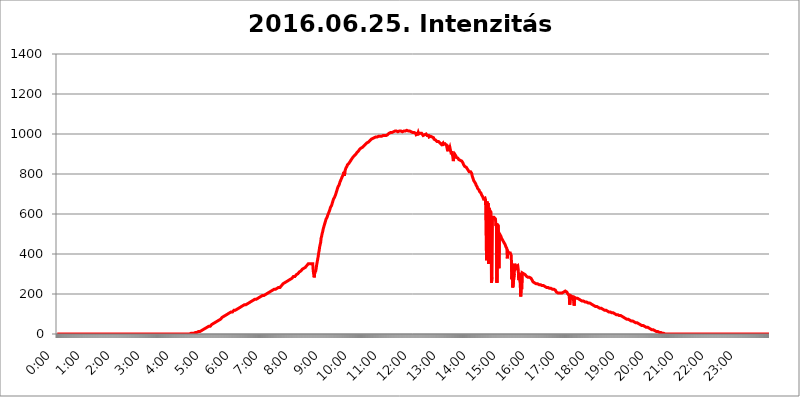
| Category | 2016.06.25. Intenzitás [W/m^2] |
|---|---|
| 0.0 | 0 |
| 0.0006944444444444445 | 0 |
| 0.001388888888888889 | 0 |
| 0.0020833333333333333 | 0 |
| 0.002777777777777778 | 0 |
| 0.003472222222222222 | 0 |
| 0.004166666666666667 | 0 |
| 0.004861111111111111 | 0 |
| 0.005555555555555556 | 0 |
| 0.0062499999999999995 | 0 |
| 0.006944444444444444 | 0 |
| 0.007638888888888889 | 0 |
| 0.008333333333333333 | 0 |
| 0.009027777777777779 | 0 |
| 0.009722222222222222 | 0 |
| 0.010416666666666666 | 0 |
| 0.011111111111111112 | 0 |
| 0.011805555555555555 | 0 |
| 0.012499999999999999 | 0 |
| 0.013194444444444444 | 0 |
| 0.013888888888888888 | 0 |
| 0.014583333333333332 | 0 |
| 0.015277777777777777 | 0 |
| 0.015972222222222224 | 0 |
| 0.016666666666666666 | 0 |
| 0.017361111111111112 | 0 |
| 0.018055555555555557 | 0 |
| 0.01875 | 0 |
| 0.019444444444444445 | 0 |
| 0.02013888888888889 | 0 |
| 0.020833333333333332 | 0 |
| 0.02152777777777778 | 0 |
| 0.022222222222222223 | 0 |
| 0.02291666666666667 | 0 |
| 0.02361111111111111 | 0 |
| 0.024305555555555556 | 0 |
| 0.024999999999999998 | 0 |
| 0.025694444444444447 | 0 |
| 0.02638888888888889 | 0 |
| 0.027083333333333334 | 0 |
| 0.027777777777777776 | 0 |
| 0.02847222222222222 | 0 |
| 0.029166666666666664 | 0 |
| 0.029861111111111113 | 0 |
| 0.030555555555555555 | 0 |
| 0.03125 | 0 |
| 0.03194444444444445 | 0 |
| 0.03263888888888889 | 0 |
| 0.03333333333333333 | 0 |
| 0.034027777777777775 | 0 |
| 0.034722222222222224 | 0 |
| 0.035416666666666666 | 0 |
| 0.036111111111111115 | 0 |
| 0.03680555555555556 | 0 |
| 0.0375 | 0 |
| 0.03819444444444444 | 0 |
| 0.03888888888888889 | 0 |
| 0.03958333333333333 | 0 |
| 0.04027777777777778 | 0 |
| 0.04097222222222222 | 0 |
| 0.041666666666666664 | 0 |
| 0.042361111111111106 | 0 |
| 0.04305555555555556 | 0 |
| 0.043750000000000004 | 0 |
| 0.044444444444444446 | 0 |
| 0.04513888888888889 | 0 |
| 0.04583333333333334 | 0 |
| 0.04652777777777778 | 0 |
| 0.04722222222222222 | 0 |
| 0.04791666666666666 | 0 |
| 0.04861111111111111 | 0 |
| 0.049305555555555554 | 0 |
| 0.049999999999999996 | 0 |
| 0.05069444444444445 | 0 |
| 0.051388888888888894 | 0 |
| 0.052083333333333336 | 0 |
| 0.05277777777777778 | 0 |
| 0.05347222222222222 | 0 |
| 0.05416666666666667 | 0 |
| 0.05486111111111111 | 0 |
| 0.05555555555555555 | 0 |
| 0.05625 | 0 |
| 0.05694444444444444 | 0 |
| 0.057638888888888885 | 0 |
| 0.05833333333333333 | 0 |
| 0.05902777777777778 | 0 |
| 0.059722222222222225 | 0 |
| 0.06041666666666667 | 0 |
| 0.061111111111111116 | 0 |
| 0.06180555555555556 | 0 |
| 0.0625 | 0 |
| 0.06319444444444444 | 0 |
| 0.06388888888888888 | 0 |
| 0.06458333333333334 | 0 |
| 0.06527777777777778 | 0 |
| 0.06597222222222222 | 0 |
| 0.06666666666666667 | 0 |
| 0.06736111111111111 | 0 |
| 0.06805555555555555 | 0 |
| 0.06874999999999999 | 0 |
| 0.06944444444444443 | 0 |
| 0.07013888888888889 | 0 |
| 0.07083333333333333 | 0 |
| 0.07152777777777779 | 0 |
| 0.07222222222222223 | 0 |
| 0.07291666666666667 | 0 |
| 0.07361111111111111 | 0 |
| 0.07430555555555556 | 0 |
| 0.075 | 0 |
| 0.07569444444444444 | 0 |
| 0.0763888888888889 | 0 |
| 0.07708333333333334 | 0 |
| 0.07777777777777778 | 0 |
| 0.07847222222222222 | 0 |
| 0.07916666666666666 | 0 |
| 0.0798611111111111 | 0 |
| 0.08055555555555556 | 0 |
| 0.08125 | 0 |
| 0.08194444444444444 | 0 |
| 0.08263888888888889 | 0 |
| 0.08333333333333333 | 0 |
| 0.08402777777777777 | 0 |
| 0.08472222222222221 | 0 |
| 0.08541666666666665 | 0 |
| 0.08611111111111112 | 0 |
| 0.08680555555555557 | 0 |
| 0.08750000000000001 | 0 |
| 0.08819444444444445 | 0 |
| 0.08888888888888889 | 0 |
| 0.08958333333333333 | 0 |
| 0.09027777777777778 | 0 |
| 0.09097222222222222 | 0 |
| 0.09166666666666667 | 0 |
| 0.09236111111111112 | 0 |
| 0.09305555555555556 | 0 |
| 0.09375 | 0 |
| 0.09444444444444444 | 0 |
| 0.09513888888888888 | 0 |
| 0.09583333333333333 | 0 |
| 0.09652777777777777 | 0 |
| 0.09722222222222222 | 0 |
| 0.09791666666666667 | 0 |
| 0.09861111111111111 | 0 |
| 0.09930555555555555 | 0 |
| 0.09999999999999999 | 0 |
| 0.10069444444444443 | 0 |
| 0.1013888888888889 | 0 |
| 0.10208333333333335 | 0 |
| 0.10277777777777779 | 0 |
| 0.10347222222222223 | 0 |
| 0.10416666666666667 | 0 |
| 0.10486111111111111 | 0 |
| 0.10555555555555556 | 0 |
| 0.10625 | 0 |
| 0.10694444444444444 | 0 |
| 0.1076388888888889 | 0 |
| 0.10833333333333334 | 0 |
| 0.10902777777777778 | 0 |
| 0.10972222222222222 | 0 |
| 0.1111111111111111 | 0 |
| 0.11180555555555556 | 0 |
| 0.11180555555555556 | 0 |
| 0.1125 | 0 |
| 0.11319444444444444 | 0 |
| 0.11388888888888889 | 0 |
| 0.11458333333333333 | 0 |
| 0.11527777777777777 | 0 |
| 0.11597222222222221 | 0 |
| 0.11666666666666665 | 0 |
| 0.1173611111111111 | 0 |
| 0.11805555555555557 | 0 |
| 0.11944444444444445 | 0 |
| 0.12013888888888889 | 0 |
| 0.12083333333333333 | 0 |
| 0.12152777777777778 | 0 |
| 0.12222222222222223 | 0 |
| 0.12291666666666667 | 0 |
| 0.12291666666666667 | 0 |
| 0.12361111111111112 | 0 |
| 0.12430555555555556 | 0 |
| 0.125 | 0 |
| 0.12569444444444444 | 0 |
| 0.12638888888888888 | 0 |
| 0.12708333333333333 | 0 |
| 0.16875 | 0 |
| 0.12847222222222224 | 0 |
| 0.12916666666666668 | 0 |
| 0.12986111111111112 | 0 |
| 0.13055555555555556 | 0 |
| 0.13125 | 0 |
| 0.13194444444444445 | 0 |
| 0.1326388888888889 | 0 |
| 0.13333333333333333 | 0 |
| 0.13402777777777777 | 0 |
| 0.13402777777777777 | 0 |
| 0.13472222222222222 | 0 |
| 0.13541666666666666 | 0 |
| 0.1361111111111111 | 0 |
| 0.13749999999999998 | 0 |
| 0.13819444444444443 | 0 |
| 0.1388888888888889 | 0 |
| 0.13958333333333334 | 0 |
| 0.14027777777777778 | 0 |
| 0.14097222222222222 | 0 |
| 0.14166666666666666 | 0 |
| 0.1423611111111111 | 0 |
| 0.14305555555555557 | 0 |
| 0.14375000000000002 | 0 |
| 0.14444444444444446 | 0 |
| 0.1451388888888889 | 0 |
| 0.1451388888888889 | 0 |
| 0.14652777777777778 | 0 |
| 0.14722222222222223 | 0 |
| 0.14791666666666667 | 0 |
| 0.1486111111111111 | 0 |
| 0.14930555555555555 | 0 |
| 0.15 | 0 |
| 0.15069444444444444 | 0 |
| 0.15138888888888888 | 0 |
| 0.15208333333333332 | 0 |
| 0.15277777777777776 | 0 |
| 0.15347222222222223 | 0 |
| 0.15416666666666667 | 0 |
| 0.15486111111111112 | 0 |
| 0.15555555555555556 | 0 |
| 0.15625 | 0 |
| 0.15694444444444444 | 0 |
| 0.15763888888888888 | 0 |
| 0.15833333333333333 | 0 |
| 0.15902777777777777 | 0 |
| 0.15972222222222224 | 0 |
| 0.16041666666666668 | 0 |
| 0.16111111111111112 | 0 |
| 0.16180555555555556 | 0 |
| 0.1625 | 0 |
| 0.16319444444444445 | 0 |
| 0.1638888888888889 | 0 |
| 0.16458333333333333 | 0 |
| 0.16527777777777777 | 0 |
| 0.16597222222222222 | 0 |
| 0.16666666666666666 | 0 |
| 0.1673611111111111 | 0 |
| 0.16805555555555554 | 0 |
| 0.16874999999999998 | 0 |
| 0.16944444444444443 | 0 |
| 0.17013888888888887 | 0 |
| 0.1708333333333333 | 0 |
| 0.17152777777777775 | 0 |
| 0.17222222222222225 | 0 |
| 0.1729166666666667 | 0 |
| 0.17361111111111113 | 0 |
| 0.17430555555555557 | 0 |
| 0.17500000000000002 | 0 |
| 0.17569444444444446 | 0 |
| 0.1763888888888889 | 0 |
| 0.17708333333333334 | 0 |
| 0.17777777777777778 | 0 |
| 0.17847222222222223 | 0 |
| 0.17916666666666667 | 0 |
| 0.1798611111111111 | 0 |
| 0.18055555555555555 | 0 |
| 0.18125 | 0 |
| 0.18194444444444444 | 0 |
| 0.1826388888888889 | 0 |
| 0.18333333333333335 | 0 |
| 0.1840277777777778 | 0 |
| 0.18472222222222223 | 0 |
| 0.18541666666666667 | 0 |
| 0.18611111111111112 | 3.525 |
| 0.18680555555555556 | 0 |
| 0.1875 | 3.525 |
| 0.18819444444444444 | 3.525 |
| 0.18888888888888888 | 3.525 |
| 0.18958333333333333 | 3.525 |
| 0.19027777777777777 | 3.525 |
| 0.1909722222222222 | 3.525 |
| 0.19166666666666665 | 3.525 |
| 0.19236111111111112 | 3.525 |
| 0.19305555555555554 | 3.525 |
| 0.19375 | 7.887 |
| 0.19444444444444445 | 7.887 |
| 0.1951388888888889 | 7.887 |
| 0.19583333333333333 | 7.887 |
| 0.19652777777777777 | 7.887 |
| 0.19722222222222222 | 12.257 |
| 0.19791666666666666 | 12.257 |
| 0.1986111111111111 | 12.257 |
| 0.19930555555555554 | 12.257 |
| 0.19999999999999998 | 12.257 |
| 0.20069444444444443 | 16.636 |
| 0.20138888888888887 | 16.636 |
| 0.2020833333333333 | 16.636 |
| 0.2027777777777778 | 21.024 |
| 0.2034722222222222 | 21.024 |
| 0.2041666666666667 | 21.024 |
| 0.20486111111111113 | 21.024 |
| 0.20555555555555557 | 21.024 |
| 0.20625000000000002 | 25.419 |
| 0.20694444444444446 | 25.419 |
| 0.2076388888888889 | 25.419 |
| 0.20833333333333334 | 29.823 |
| 0.20902777777777778 | 29.823 |
| 0.20972222222222223 | 29.823 |
| 0.21041666666666667 | 34.234 |
| 0.2111111111111111 | 34.234 |
| 0.21180555555555555 | 34.234 |
| 0.2125 | 38.653 |
| 0.21319444444444444 | 38.653 |
| 0.2138888888888889 | 38.653 |
| 0.21458333333333335 | 38.653 |
| 0.2152777777777778 | 43.079 |
| 0.21597222222222223 | 43.079 |
| 0.21666666666666667 | 47.511 |
| 0.21736111111111112 | 47.511 |
| 0.21805555555555556 | 47.511 |
| 0.21875 | 51.951 |
| 0.21944444444444444 | 51.951 |
| 0.22013888888888888 | 51.951 |
| 0.22083333333333333 | 56.398 |
| 0.22152777777777777 | 56.398 |
| 0.2222222222222222 | 60.85 |
| 0.22291666666666665 | 60.85 |
| 0.2236111111111111 | 60.85 |
| 0.22430555555555556 | 65.31 |
| 0.225 | 65.31 |
| 0.22569444444444445 | 69.775 |
| 0.2263888888888889 | 69.775 |
| 0.22708333333333333 | 69.775 |
| 0.22777777777777777 | 74.246 |
| 0.22847222222222222 | 74.246 |
| 0.22916666666666666 | 74.246 |
| 0.2298611111111111 | 78.722 |
| 0.23055555555555554 | 78.722 |
| 0.23124999999999998 | 83.205 |
| 0.23194444444444443 | 83.205 |
| 0.23263888888888887 | 83.205 |
| 0.2333333333333333 | 87.692 |
| 0.2340277777777778 | 87.692 |
| 0.2347222222222222 | 87.692 |
| 0.2354166666666667 | 92.184 |
| 0.23611111111111113 | 92.184 |
| 0.23680555555555557 | 92.184 |
| 0.23750000000000002 | 96.682 |
| 0.23819444444444446 | 96.682 |
| 0.2388888888888889 | 101.184 |
| 0.23958333333333334 | 101.184 |
| 0.24027777777777778 | 101.184 |
| 0.24097222222222223 | 101.184 |
| 0.24166666666666667 | 105.69 |
| 0.2423611111111111 | 105.69 |
| 0.24305555555555555 | 105.69 |
| 0.24375 | 110.201 |
| 0.24444444444444446 | 110.201 |
| 0.24513888888888888 | 110.201 |
| 0.24583333333333335 | 110.201 |
| 0.2465277777777778 | 114.716 |
| 0.24722222222222223 | 114.716 |
| 0.24791666666666667 | 119.235 |
| 0.24861111111111112 | 119.235 |
| 0.24930555555555556 | 119.235 |
| 0.25 | 119.235 |
| 0.25069444444444444 | 123.758 |
| 0.2513888888888889 | 123.758 |
| 0.2520833333333333 | 123.758 |
| 0.25277777777777777 | 128.284 |
| 0.2534722222222222 | 128.284 |
| 0.25416666666666665 | 128.284 |
| 0.2548611111111111 | 128.284 |
| 0.2555555555555556 | 132.814 |
| 0.25625000000000003 | 132.814 |
| 0.2569444444444445 | 132.814 |
| 0.2576388888888889 | 137.347 |
| 0.25833333333333336 | 137.347 |
| 0.2590277777777778 | 137.347 |
| 0.25972222222222224 | 137.347 |
| 0.2604166666666667 | 141.884 |
| 0.2611111111111111 | 141.884 |
| 0.26180555555555557 | 141.884 |
| 0.2625 | 146.423 |
| 0.26319444444444445 | 146.423 |
| 0.2638888888888889 | 146.423 |
| 0.26458333333333334 | 146.423 |
| 0.2652777777777778 | 150.964 |
| 0.2659722222222222 | 150.964 |
| 0.26666666666666666 | 150.964 |
| 0.2673611111111111 | 155.509 |
| 0.26805555555555555 | 155.509 |
| 0.26875 | 155.509 |
| 0.26944444444444443 | 155.509 |
| 0.2701388888888889 | 160.056 |
| 0.2708333333333333 | 160.056 |
| 0.27152777777777776 | 160.056 |
| 0.2722222222222222 | 164.605 |
| 0.27291666666666664 | 164.605 |
| 0.2736111111111111 | 164.605 |
| 0.2743055555555555 | 164.605 |
| 0.27499999999999997 | 169.156 |
| 0.27569444444444446 | 169.156 |
| 0.27638888888888885 | 169.156 |
| 0.27708333333333335 | 173.709 |
| 0.2777777777777778 | 173.709 |
| 0.27847222222222223 | 173.709 |
| 0.2791666666666667 | 173.709 |
| 0.2798611111111111 | 178.264 |
| 0.28055555555555556 | 178.264 |
| 0.28125 | 178.264 |
| 0.28194444444444444 | 182.82 |
| 0.2826388888888889 | 182.82 |
| 0.2833333333333333 | 182.82 |
| 0.28402777777777777 | 182.82 |
| 0.2847222222222222 | 187.378 |
| 0.28541666666666665 | 187.378 |
| 0.28611111111111115 | 187.378 |
| 0.28680555555555554 | 191.937 |
| 0.28750000000000003 | 191.937 |
| 0.2881944444444445 | 191.937 |
| 0.2888888888888889 | 191.937 |
| 0.28958333333333336 | 191.937 |
| 0.2902777777777778 | 191.937 |
| 0.29097222222222224 | 196.497 |
| 0.2916666666666667 | 196.497 |
| 0.2923611111111111 | 196.497 |
| 0.29305555555555557 | 201.058 |
| 0.29375 | 201.058 |
| 0.29444444444444445 | 201.058 |
| 0.2951388888888889 | 205.62 |
| 0.29583333333333334 | 205.62 |
| 0.2965277777777778 | 205.62 |
| 0.2972222222222222 | 210.182 |
| 0.29791666666666666 | 210.182 |
| 0.2986111111111111 | 210.182 |
| 0.29930555555555555 | 210.182 |
| 0.3 | 214.746 |
| 0.30069444444444443 | 214.746 |
| 0.3013888888888889 | 214.746 |
| 0.3020833333333333 | 219.309 |
| 0.30277777777777776 | 219.309 |
| 0.3034722222222222 | 219.309 |
| 0.30416666666666664 | 223.873 |
| 0.3048611111111111 | 223.873 |
| 0.3055555555555555 | 223.873 |
| 0.30624999999999997 | 223.873 |
| 0.3069444444444444 | 228.436 |
| 0.3076388888888889 | 228.436 |
| 0.30833333333333335 | 228.436 |
| 0.3090277777777778 | 228.436 |
| 0.30972222222222223 | 228.436 |
| 0.3104166666666667 | 233 |
| 0.3111111111111111 | 233 |
| 0.31180555555555556 | 233 |
| 0.3125 | 233 |
| 0.31319444444444444 | 237.564 |
| 0.3138888888888889 | 237.564 |
| 0.3145833333333333 | 242.127 |
| 0.31527777777777777 | 242.127 |
| 0.3159722222222222 | 246.689 |
| 0.31666666666666665 | 251.251 |
| 0.31736111111111115 | 251.251 |
| 0.31805555555555554 | 251.251 |
| 0.31875000000000003 | 255.813 |
| 0.3194444444444445 | 255.813 |
| 0.3201388888888889 | 260.373 |
| 0.32083333333333336 | 260.373 |
| 0.3215277777777778 | 260.373 |
| 0.32222222222222224 | 260.373 |
| 0.3229166666666667 | 264.932 |
| 0.3236111111111111 | 264.932 |
| 0.32430555555555557 | 269.49 |
| 0.325 | 269.49 |
| 0.32569444444444445 | 269.49 |
| 0.3263888888888889 | 274.047 |
| 0.32708333333333334 | 274.047 |
| 0.3277777777777778 | 278.603 |
| 0.3284722222222222 | 278.603 |
| 0.32916666666666666 | 278.603 |
| 0.3298611111111111 | 283.156 |
| 0.33055555555555555 | 283.156 |
| 0.33125 | 287.709 |
| 0.33194444444444443 | 287.709 |
| 0.3326388888888889 | 287.709 |
| 0.3333333333333333 | 287.709 |
| 0.3340277777777778 | 292.259 |
| 0.3347222222222222 | 292.259 |
| 0.3354166666666667 | 296.808 |
| 0.3361111111111111 | 296.808 |
| 0.3368055555555556 | 296.808 |
| 0.33749999999999997 | 301.354 |
| 0.33819444444444446 | 305.898 |
| 0.33888888888888885 | 305.898 |
| 0.33958333333333335 | 310.44 |
| 0.34027777777777773 | 310.44 |
| 0.34097222222222223 | 314.98 |
| 0.3416666666666666 | 314.98 |
| 0.3423611111111111 | 314.98 |
| 0.3430555555555555 | 319.517 |
| 0.34375 | 324.052 |
| 0.3444444444444445 | 324.052 |
| 0.3451388888888889 | 324.052 |
| 0.3458333333333334 | 328.584 |
| 0.34652777777777777 | 328.584 |
| 0.34722222222222227 | 333.113 |
| 0.34791666666666665 | 333.113 |
| 0.34861111111111115 | 337.639 |
| 0.34930555555555554 | 337.639 |
| 0.35000000000000003 | 342.162 |
| 0.3506944444444444 | 342.162 |
| 0.3513888888888889 | 346.682 |
| 0.3520833333333333 | 351.198 |
| 0.3527777777777778 | 351.198 |
| 0.3534722222222222 | 351.198 |
| 0.3541666666666667 | 351.198 |
| 0.3548611111111111 | 355.712 |
| 0.35555555555555557 | 351.198 |
| 0.35625 | 351.198 |
| 0.35694444444444445 | 351.198 |
| 0.3576388888888889 | 351.198 |
| 0.35833333333333334 | 351.198 |
| 0.3590277777777778 | 314.98 |
| 0.3597222222222222 | 319.517 |
| 0.36041666666666666 | 283.156 |
| 0.3611111111111111 | 305.898 |
| 0.36180555555555555 | 301.354 |
| 0.3625 | 314.98 |
| 0.36319444444444443 | 328.584 |
| 0.3638888888888889 | 346.682 |
| 0.3645833333333333 | 360.221 |
| 0.3652777777777778 | 364.728 |
| 0.3659722222222222 | 387.202 |
| 0.3666666666666667 | 405.108 |
| 0.3673611111111111 | 418.492 |
| 0.3680555555555556 | 436.27 |
| 0.36874999999999997 | 440.702 |
| 0.36944444444444446 | 458.38 |
| 0.37013888888888885 | 480.356 |
| 0.37083333333333335 | 489.108 |
| 0.37152777777777773 | 502.192 |
| 0.37222222222222223 | 510.885 |
| 0.3729166666666666 | 523.88 |
| 0.3736111111111111 | 532.513 |
| 0.3743055555555555 | 541.121 |
| 0.375 | 549.704 |
| 0.3756944444444445 | 558.261 |
| 0.3763888888888889 | 566.793 |
| 0.3770833333333334 | 575.299 |
| 0.37777777777777777 | 579.542 |
| 0.37847222222222227 | 583.779 |
| 0.37916666666666665 | 592.233 |
| 0.37986111111111115 | 596.45 |
| 0.38055555555555554 | 604.864 |
| 0.38125000000000003 | 609.062 |
| 0.3819444444444444 | 617.436 |
| 0.3826388888888889 | 625.784 |
| 0.3833333333333333 | 634.105 |
| 0.3840277777777778 | 638.256 |
| 0.3847222222222222 | 642.4 |
| 0.3854166666666667 | 650.667 |
| 0.3861111111111111 | 658.909 |
| 0.38680555555555557 | 667.123 |
| 0.3875 | 675.311 |
| 0.38819444444444445 | 679.395 |
| 0.3888888888888889 | 683.473 |
| 0.38958333333333334 | 687.544 |
| 0.3902777777777778 | 695.666 |
| 0.3909722222222222 | 703.762 |
| 0.39166666666666666 | 711.832 |
| 0.3923611111111111 | 719.877 |
| 0.39305555555555555 | 727.896 |
| 0.39375 | 735.89 |
| 0.39444444444444443 | 739.877 |
| 0.3951388888888889 | 743.859 |
| 0.3958333333333333 | 751.803 |
| 0.3965277777777778 | 759.723 |
| 0.3972222222222222 | 763.674 |
| 0.3979166666666667 | 771.559 |
| 0.3986111111111111 | 767.62 |
| 0.3993055555555556 | 783.342 |
| 0.39999999999999997 | 787.258 |
| 0.40069444444444446 | 787.258 |
| 0.40138888888888885 | 798.974 |
| 0.40208333333333335 | 810.641 |
| 0.40277777777777773 | 791.169 |
| 0.40347222222222223 | 814.519 |
| 0.4041666666666666 | 822.26 |
| 0.4048611111111111 | 829.981 |
| 0.4055555555555555 | 833.834 |
| 0.40625 | 837.682 |
| 0.4069444444444445 | 845.365 |
| 0.4076388888888889 | 845.365 |
| 0.4083333333333334 | 849.199 |
| 0.40902777777777777 | 853.029 |
| 0.40972222222222227 | 856.855 |
| 0.41041666666666665 | 860.676 |
| 0.41111111111111115 | 864.493 |
| 0.41180555555555554 | 868.305 |
| 0.41250000000000003 | 872.114 |
| 0.4131944444444444 | 875.918 |
| 0.4138888888888889 | 879.719 |
| 0.4145833333333333 | 883.516 |
| 0.4152777777777778 | 883.516 |
| 0.4159722222222222 | 887.309 |
| 0.4166666666666667 | 891.099 |
| 0.4173611111111111 | 891.099 |
| 0.41805555555555557 | 894.885 |
| 0.41875 | 898.668 |
| 0.41944444444444445 | 902.447 |
| 0.4201388888888889 | 906.223 |
| 0.42083333333333334 | 909.996 |
| 0.4215277777777778 | 909.996 |
| 0.4222222222222222 | 913.766 |
| 0.42291666666666666 | 917.534 |
| 0.4236111111111111 | 921.298 |
| 0.42430555555555555 | 921.298 |
| 0.425 | 925.06 |
| 0.42569444444444443 | 928.819 |
| 0.4263888888888889 | 928.819 |
| 0.4270833333333333 | 928.819 |
| 0.4277777777777778 | 932.576 |
| 0.4284722222222222 | 932.576 |
| 0.4291666666666667 | 936.33 |
| 0.4298611111111111 | 940.082 |
| 0.4305555555555556 | 940.082 |
| 0.43124999999999997 | 943.832 |
| 0.43194444444444446 | 947.58 |
| 0.43263888888888885 | 947.58 |
| 0.43333333333333335 | 951.327 |
| 0.43402777777777773 | 955.071 |
| 0.43472222222222223 | 955.071 |
| 0.4354166666666666 | 958.814 |
| 0.4361111111111111 | 958.814 |
| 0.4368055555555555 | 962.555 |
| 0.4375 | 962.555 |
| 0.4381944444444445 | 966.295 |
| 0.4388888888888889 | 966.295 |
| 0.4395833333333334 | 970.034 |
| 0.44027777777777777 | 973.772 |
| 0.44097222222222227 | 973.772 |
| 0.44166666666666665 | 973.772 |
| 0.44236111111111115 | 977.508 |
| 0.44305555555555554 | 977.508 |
| 0.44375000000000003 | 981.244 |
| 0.4444444444444444 | 981.244 |
| 0.4451388888888889 | 981.244 |
| 0.4458333333333333 | 984.98 |
| 0.4465277777777778 | 984.98 |
| 0.4472222222222222 | 988.714 |
| 0.4479166666666667 | 984.98 |
| 0.4486111111111111 | 984.98 |
| 0.44930555555555557 | 988.714 |
| 0.45 | 988.714 |
| 0.45069444444444445 | 988.714 |
| 0.4513888888888889 | 988.714 |
| 0.45208333333333334 | 984.98 |
| 0.4527777777777778 | 988.714 |
| 0.4534722222222222 | 984.98 |
| 0.45416666666666666 | 984.98 |
| 0.4548611111111111 | 988.714 |
| 0.45555555555555555 | 988.714 |
| 0.45625 | 992.448 |
| 0.45694444444444443 | 992.448 |
| 0.4576388888888889 | 992.448 |
| 0.4583333333333333 | 992.448 |
| 0.4590277777777778 | 992.448 |
| 0.4597222222222222 | 996.182 |
| 0.4604166666666667 | 996.182 |
| 0.4611111111111111 | 992.448 |
| 0.4618055555555556 | 992.448 |
| 0.46249999999999997 | 996.182 |
| 0.46319444444444446 | 996.182 |
| 0.46388888888888885 | 999.916 |
| 0.46458333333333335 | 999.916 |
| 0.46527777777777773 | 1003.65 |
| 0.46597222222222223 | 1003.65 |
| 0.4666666666666666 | 1003.65 |
| 0.4673611111111111 | 1007.383 |
| 0.4680555555555555 | 1007.383 |
| 0.46875 | 1007.383 |
| 0.4694444444444445 | 1007.383 |
| 0.4701388888888889 | 1007.383 |
| 0.4708333333333334 | 1007.383 |
| 0.47152777777777777 | 1011.118 |
| 0.47222222222222227 | 1011.118 |
| 0.47291666666666665 | 1014.852 |
| 0.47361111111111115 | 1014.852 |
| 0.47430555555555554 | 1014.852 |
| 0.47500000000000003 | 1014.852 |
| 0.4756944444444444 | 1014.852 |
| 0.4763888888888889 | 1014.852 |
| 0.4770833333333333 | 1011.118 |
| 0.4777777777777778 | 1011.118 |
| 0.4784722222222222 | 1011.118 |
| 0.4791666666666667 | 1011.118 |
| 0.4798611111111111 | 1014.852 |
| 0.48055555555555557 | 1011.118 |
| 0.48125 | 1014.852 |
| 0.48194444444444445 | 1014.852 |
| 0.4826388888888889 | 1014.852 |
| 0.48333333333333334 | 1014.852 |
| 0.4840277777777778 | 1011.118 |
| 0.4847222222222222 | 1011.118 |
| 0.48541666666666666 | 1011.118 |
| 0.4861111111111111 | 1014.852 |
| 0.48680555555555555 | 1011.118 |
| 0.4875 | 1011.118 |
| 0.48819444444444443 | 1014.852 |
| 0.4888888888888889 | 1014.852 |
| 0.4895833333333333 | 1014.852 |
| 0.4902777777777778 | 1018.587 |
| 0.4909722222222222 | 1014.852 |
| 0.4916666666666667 | 1014.852 |
| 0.4923611111111111 | 1014.852 |
| 0.4930555555555556 | 1014.852 |
| 0.49374999999999997 | 1014.852 |
| 0.49444444444444446 | 1014.852 |
| 0.49513888888888885 | 1011.118 |
| 0.49583333333333335 | 1014.852 |
| 0.49652777777777773 | 1011.118 |
| 0.49722222222222223 | 1011.118 |
| 0.4979166666666666 | 1011.118 |
| 0.4986111111111111 | 1007.383 |
| 0.4993055555555555 | 1007.383 |
| 0.5 | 1007.383 |
| 0.5006944444444444 | 1007.383 |
| 0.5013888888888889 | 1007.383 |
| 0.5020833333333333 | 1007.383 |
| 0.5027777777777778 | 1003.65 |
| 0.5034722222222222 | 996.182 |
| 0.5041666666666667 | 992.448 |
| 0.5048611111111111 | 996.182 |
| 0.5055555555555555 | 999.916 |
| 0.50625 | 1007.383 |
| 0.5069444444444444 | 999.916 |
| 0.5076388888888889 | 996.182 |
| 0.5083333333333333 | 999.916 |
| 0.5090277777777777 | 1003.65 |
| 0.5097222222222222 | 999.916 |
| 0.5104166666666666 | 999.916 |
| 0.5111111111111112 | 1003.65 |
| 0.5118055555555555 | 1003.65 |
| 0.5125000000000001 | 999.916 |
| 0.5131944444444444 | 992.448 |
| 0.513888888888889 | 992.448 |
| 0.5145833333333333 | 992.448 |
| 0.5152777777777778 | 996.182 |
| 0.5159722222222222 | 999.916 |
| 0.5166666666666667 | 999.916 |
| 0.517361111111111 | 999.916 |
| 0.5180555555555556 | 996.182 |
| 0.5187499999999999 | 992.448 |
| 0.5194444444444445 | 992.448 |
| 0.5201388888888888 | 992.448 |
| 0.5208333333333334 | 992.448 |
| 0.5215277777777778 | 984.98 |
| 0.5222222222222223 | 984.98 |
| 0.5229166666666667 | 984.98 |
| 0.5236111111111111 | 988.714 |
| 0.5243055555555556 | 988.714 |
| 0.525 | 984.98 |
| 0.5256944444444445 | 984.98 |
| 0.5263888888888889 | 981.244 |
| 0.5270833333333333 | 981.244 |
| 0.5277777777777778 | 981.244 |
| 0.5284722222222222 | 973.772 |
| 0.5291666666666667 | 970.034 |
| 0.5298611111111111 | 973.772 |
| 0.5305555555555556 | 970.034 |
| 0.53125 | 970.034 |
| 0.5319444444444444 | 966.295 |
| 0.5326388888888889 | 962.555 |
| 0.5333333333333333 | 966.295 |
| 0.5340277777777778 | 962.555 |
| 0.5347222222222222 | 962.555 |
| 0.5354166666666667 | 962.555 |
| 0.5361111111111111 | 958.814 |
| 0.5368055555555555 | 955.071 |
| 0.5375 | 955.071 |
| 0.5381944444444444 | 955.071 |
| 0.5388888888888889 | 947.58 |
| 0.5395833333333333 | 951.327 |
| 0.5402777777777777 | 951.327 |
| 0.5409722222222222 | 955.071 |
| 0.5416666666666666 | 947.58 |
| 0.5423611111111112 | 951.327 |
| 0.5430555555555555 | 947.58 |
| 0.5437500000000001 | 951.327 |
| 0.5444444444444444 | 947.58 |
| 0.545138888888889 | 947.58 |
| 0.5458333333333333 | 943.832 |
| 0.5465277777777778 | 943.832 |
| 0.5472222222222222 | 921.298 |
| 0.5479166666666667 | 913.766 |
| 0.548611111111111 | 932.576 |
| 0.5493055555555556 | 936.33 |
| 0.5499999999999999 | 925.06 |
| 0.5506944444444445 | 932.576 |
| 0.5513888888888888 | 928.819 |
| 0.5520833333333334 | 928.819 |
| 0.5527777777777778 | 898.668 |
| 0.5534722222222223 | 913.766 |
| 0.5541666666666667 | 898.668 |
| 0.5548611111111111 | 883.516 |
| 0.5555555555555556 | 864.493 |
| 0.55625 | 883.516 |
| 0.5569444444444445 | 887.309 |
| 0.5576388888888889 | 898.668 |
| 0.5583333333333333 | 894.885 |
| 0.5590277777777778 | 891.099 |
| 0.5597222222222222 | 883.516 |
| 0.5604166666666667 | 887.309 |
| 0.5611111111111111 | 883.516 |
| 0.5618055555555556 | 879.719 |
| 0.5625 | 875.918 |
| 0.5631944444444444 | 872.114 |
| 0.5638888888888889 | 875.918 |
| 0.5645833333333333 | 868.305 |
| 0.5652777777777778 | 868.305 |
| 0.5659722222222222 | 868.305 |
| 0.5666666666666667 | 868.305 |
| 0.5673611111111111 | 864.493 |
| 0.5680555555555555 | 864.493 |
| 0.56875 | 856.855 |
| 0.5694444444444444 | 853.029 |
| 0.5701388888888889 | 845.365 |
| 0.5708333333333333 | 841.526 |
| 0.5715277777777777 | 837.682 |
| 0.5722222222222222 | 837.682 |
| 0.5729166666666666 | 833.834 |
| 0.5736111111111112 | 833.834 |
| 0.5743055555555555 | 833.834 |
| 0.5750000000000001 | 826.123 |
| 0.5756944444444444 | 822.26 |
| 0.576388888888889 | 818.392 |
| 0.5770833333333333 | 814.519 |
| 0.5777777777777778 | 810.641 |
| 0.5784722222222222 | 810.641 |
| 0.5791666666666667 | 810.641 |
| 0.579861111111111 | 810.641 |
| 0.5805555555555556 | 810.641 |
| 0.5812499999999999 | 802.868 |
| 0.5819444444444445 | 791.169 |
| 0.5826388888888888 | 787.258 |
| 0.5833333333333334 | 775.492 |
| 0.5840277777777778 | 767.62 |
| 0.5847222222222223 | 767.62 |
| 0.5854166666666667 | 759.723 |
| 0.5861111111111111 | 755.766 |
| 0.5868055555555556 | 751.803 |
| 0.5875 | 743.859 |
| 0.5881944444444445 | 743.859 |
| 0.5888888888888889 | 735.89 |
| 0.5895833333333333 | 727.896 |
| 0.5902777777777778 | 727.896 |
| 0.5909722222222222 | 723.889 |
| 0.5916666666666667 | 719.877 |
| 0.5923611111111111 | 711.832 |
| 0.5930555555555556 | 711.832 |
| 0.59375 | 707.8 |
| 0.5944444444444444 | 703.762 |
| 0.5951388888888889 | 695.666 |
| 0.5958333333333333 | 691.608 |
| 0.5965277777777778 | 687.544 |
| 0.5972222222222222 | 683.473 |
| 0.5979166666666667 | 675.311 |
| 0.5986111111111111 | 675.311 |
| 0.5993055555555555 | 679.395 |
| 0.6 | 679.395 |
| 0.6006944444444444 | 671.22 |
| 0.6013888888888889 | 675.311 |
| 0.6020833333333333 | 369.23 |
| 0.6027777777777777 | 663.019 |
| 0.6034722222222222 | 440.702 |
| 0.6041666666666666 | 654.791 |
| 0.6048611111111112 | 351.198 |
| 0.6055555555555555 | 629.948 |
| 0.6062500000000001 | 621.613 |
| 0.6069444444444444 | 617.436 |
| 0.607638888888889 | 617.436 |
| 0.6083333333333333 | 609.062 |
| 0.6090277777777778 | 255.813 |
| 0.6097222222222222 | 283.156 |
| 0.6104166666666667 | 583.779 |
| 0.611111111111111 | 579.542 |
| 0.6118055555555556 | 579.542 |
| 0.6124999999999999 | 583.779 |
| 0.6131944444444445 | 579.542 |
| 0.6138888888888888 | 579.542 |
| 0.6145833333333334 | 575.299 |
| 0.6152777777777778 | 541.121 |
| 0.6159722222222223 | 553.986 |
| 0.6166666666666667 | 255.813 |
| 0.6173611111111111 | 549.704 |
| 0.6180555555555556 | 545.416 |
| 0.61875 | 536.82 |
| 0.6194444444444445 | 328.584 |
| 0.6201388888888889 | 489.108 |
| 0.6208333333333333 | 497.836 |
| 0.6215277777777778 | 493.475 |
| 0.6222222222222222 | 489.108 |
| 0.6229166666666667 | 480.356 |
| 0.6236111111111111 | 475.972 |
| 0.6243055555555556 | 471.582 |
| 0.625 | 471.582 |
| 0.6256944444444444 | 462.786 |
| 0.6263888888888889 | 462.786 |
| 0.6270833333333333 | 453.968 |
| 0.6277777777777778 | 449.551 |
| 0.6284722222222222 | 445.129 |
| 0.6291666666666667 | 436.27 |
| 0.6298611111111111 | 431.833 |
| 0.6305555555555555 | 427.39 |
| 0.63125 | 378.224 |
| 0.6319444444444444 | 414.035 |
| 0.6326388888888889 | 409.574 |
| 0.6333333333333333 | 405.108 |
| 0.6340277777777777 | 409.574 |
| 0.6347222222222222 | 405.108 |
| 0.6354166666666666 | 405.108 |
| 0.6361111111111112 | 405.108 |
| 0.6368055555555555 | 391.685 |
| 0.6375000000000001 | 274.047 |
| 0.6381944444444444 | 351.198 |
| 0.638888888888889 | 233 |
| 0.6395833333333333 | 228.436 |
| 0.6402777777777778 | 233 |
| 0.6409722222222222 | 301.354 |
| 0.6416666666666667 | 351.198 |
| 0.642361111111111 | 337.639 |
| 0.6430555555555556 | 319.517 |
| 0.6437499999999999 | 337.639 |
| 0.6444444444444445 | 337.639 |
| 0.6451388888888888 | 342.162 |
| 0.6458333333333334 | 342.162 |
| 0.6465277777777778 | 324.052 |
| 0.6472222222222223 | 269.49 |
| 0.6479166666666667 | 278.603 |
| 0.6486111111111111 | 305.898 |
| 0.6493055555555556 | 255.813 |
| 0.65 | 187.378 |
| 0.6506944444444445 | 233 |
| 0.6513888888888889 | 223.873 |
| 0.6520833333333333 | 305.898 |
| 0.6527777777777778 | 305.898 |
| 0.6534722222222222 | 301.354 |
| 0.6541666666666667 | 301.354 |
| 0.6548611111111111 | 296.808 |
| 0.6555555555555556 | 296.808 |
| 0.65625 | 296.808 |
| 0.6569444444444444 | 292.259 |
| 0.6576388888888889 | 292.259 |
| 0.6583333333333333 | 287.709 |
| 0.6590277777777778 | 287.709 |
| 0.6597222222222222 | 283.156 |
| 0.6604166666666667 | 283.156 |
| 0.6611111111111111 | 283.156 |
| 0.6618055555555555 | 283.156 |
| 0.6625 | 283.156 |
| 0.6631944444444444 | 278.603 |
| 0.6638888888888889 | 278.603 |
| 0.6645833333333333 | 278.603 |
| 0.6652777777777777 | 274.047 |
| 0.6659722222222222 | 269.49 |
| 0.6666666666666666 | 264.932 |
| 0.6673611111111111 | 260.373 |
| 0.6680555555555556 | 260.373 |
| 0.6687500000000001 | 255.813 |
| 0.6694444444444444 | 255.813 |
| 0.6701388888888888 | 255.813 |
| 0.6708333333333334 | 255.813 |
| 0.6715277777777778 | 251.251 |
| 0.6722222222222222 | 251.251 |
| 0.6729166666666666 | 251.251 |
| 0.6736111111111112 | 251.251 |
| 0.6743055555555556 | 251.251 |
| 0.6749999999999999 | 251.251 |
| 0.6756944444444444 | 246.689 |
| 0.6763888888888889 | 246.689 |
| 0.6770833333333334 | 246.689 |
| 0.6777777777777777 | 246.689 |
| 0.6784722222222223 | 242.127 |
| 0.6791666666666667 | 246.689 |
| 0.6798611111111111 | 242.127 |
| 0.6805555555555555 | 242.127 |
| 0.68125 | 242.127 |
| 0.6819444444444445 | 242.127 |
| 0.6826388888888889 | 242.127 |
| 0.6833333333333332 | 237.564 |
| 0.6840277777777778 | 237.564 |
| 0.6847222222222222 | 237.564 |
| 0.6854166666666667 | 237.564 |
| 0.686111111111111 | 233 |
| 0.6868055555555556 | 233 |
| 0.6875 | 233 |
| 0.6881944444444444 | 233 |
| 0.688888888888889 | 228.436 |
| 0.6895833333333333 | 228.436 |
| 0.6902777777777778 | 228.436 |
| 0.6909722222222222 | 228.436 |
| 0.6916666666666668 | 228.436 |
| 0.6923611111111111 | 228.436 |
| 0.6930555555555555 | 223.873 |
| 0.69375 | 228.436 |
| 0.6944444444444445 | 223.873 |
| 0.6951388888888889 | 223.873 |
| 0.6958333333333333 | 223.873 |
| 0.6965277777777777 | 223.873 |
| 0.6972222222222223 | 223.873 |
| 0.6979166666666666 | 219.309 |
| 0.6986111111111111 | 219.309 |
| 0.6993055555555556 | 214.746 |
| 0.7000000000000001 | 210.182 |
| 0.7006944444444444 | 210.182 |
| 0.7013888888888888 | 210.182 |
| 0.7020833333333334 | 205.62 |
| 0.7027777777777778 | 205.62 |
| 0.7034722222222222 | 205.62 |
| 0.7041666666666666 | 205.62 |
| 0.7048611111111112 | 205.62 |
| 0.7055555555555556 | 205.62 |
| 0.7062499999999999 | 205.62 |
| 0.7069444444444444 | 205.62 |
| 0.7076388888888889 | 205.62 |
| 0.7083333333333334 | 205.62 |
| 0.7090277777777777 | 205.62 |
| 0.7097222222222223 | 205.62 |
| 0.7104166666666667 | 210.182 |
| 0.7111111111111111 | 210.182 |
| 0.7118055555555555 | 214.746 |
| 0.7125 | 214.746 |
| 0.7131944444444445 | 214.746 |
| 0.7138888888888889 | 210.182 |
| 0.7145833333333332 | 210.182 |
| 0.7152777777777778 | 205.62 |
| 0.7159722222222222 | 201.058 |
| 0.7166666666666667 | 201.058 |
| 0.717361111111111 | 196.497 |
| 0.7180555555555556 | 191.937 |
| 0.71875 | 146.423 |
| 0.7194444444444444 | 178.264 |
| 0.720138888888889 | 191.937 |
| 0.7208333333333333 | 191.937 |
| 0.7215277777777778 | 191.937 |
| 0.7222222222222222 | 187.378 |
| 0.7229166666666668 | 182.82 |
| 0.7236111111111111 | 182.82 |
| 0.7243055555555555 | 164.605 |
| 0.725 | 141.884 |
| 0.7256944444444445 | 182.82 |
| 0.7263888888888889 | 182.82 |
| 0.7270833333333333 | 178.264 |
| 0.7277777777777777 | 178.264 |
| 0.7284722222222223 | 178.264 |
| 0.7291666666666666 | 178.264 |
| 0.7298611111111111 | 178.264 |
| 0.7305555555555556 | 173.709 |
| 0.7312500000000001 | 173.709 |
| 0.7319444444444444 | 173.709 |
| 0.7326388888888888 | 173.709 |
| 0.7333333333333334 | 169.156 |
| 0.7340277777777778 | 169.156 |
| 0.7347222222222222 | 169.156 |
| 0.7354166666666666 | 169.156 |
| 0.7361111111111112 | 164.605 |
| 0.7368055555555556 | 164.605 |
| 0.7374999999999999 | 164.605 |
| 0.7381944444444444 | 164.605 |
| 0.7388888888888889 | 164.605 |
| 0.7395833333333334 | 164.605 |
| 0.7402777777777777 | 160.056 |
| 0.7409722222222223 | 160.056 |
| 0.7416666666666667 | 160.056 |
| 0.7423611111111111 | 160.056 |
| 0.7430555555555555 | 155.509 |
| 0.74375 | 155.509 |
| 0.7444444444444445 | 155.509 |
| 0.7451388888888889 | 155.509 |
| 0.7458333333333332 | 155.509 |
| 0.7465277777777778 | 155.509 |
| 0.7472222222222222 | 150.964 |
| 0.7479166666666667 | 150.964 |
| 0.748611111111111 | 150.964 |
| 0.7493055555555556 | 146.423 |
| 0.75 | 146.423 |
| 0.7506944444444444 | 146.423 |
| 0.751388888888889 | 146.423 |
| 0.7520833333333333 | 141.884 |
| 0.7527777777777778 | 141.884 |
| 0.7534722222222222 | 141.884 |
| 0.7541666666666668 | 141.884 |
| 0.7548611111111111 | 137.347 |
| 0.7555555555555555 | 137.347 |
| 0.75625 | 137.347 |
| 0.7569444444444445 | 137.347 |
| 0.7576388888888889 | 137.347 |
| 0.7583333333333333 | 137.347 |
| 0.7590277777777777 | 132.814 |
| 0.7597222222222223 | 132.814 |
| 0.7604166666666666 | 132.814 |
| 0.7611111111111111 | 128.284 |
| 0.7618055555555556 | 128.284 |
| 0.7625000000000001 | 128.284 |
| 0.7631944444444444 | 128.284 |
| 0.7638888888888888 | 128.284 |
| 0.7645833333333334 | 123.758 |
| 0.7652777777777778 | 123.758 |
| 0.7659722222222222 | 123.758 |
| 0.7666666666666666 | 123.758 |
| 0.7673611111111112 | 119.235 |
| 0.7680555555555556 | 119.235 |
| 0.7687499999999999 | 119.235 |
| 0.7694444444444444 | 119.235 |
| 0.7701388888888889 | 114.716 |
| 0.7708333333333334 | 114.716 |
| 0.7715277777777777 | 114.716 |
| 0.7722222222222223 | 114.716 |
| 0.7729166666666667 | 110.201 |
| 0.7736111111111111 | 110.201 |
| 0.7743055555555555 | 110.201 |
| 0.775 | 110.201 |
| 0.7756944444444445 | 110.201 |
| 0.7763888888888889 | 110.201 |
| 0.7770833333333332 | 105.69 |
| 0.7777777777777778 | 105.69 |
| 0.7784722222222222 | 105.69 |
| 0.7791666666666667 | 105.69 |
| 0.779861111111111 | 105.69 |
| 0.7805555555555556 | 101.184 |
| 0.78125 | 101.184 |
| 0.7819444444444444 | 101.184 |
| 0.782638888888889 | 101.184 |
| 0.7833333333333333 | 101.184 |
| 0.7840277777777778 | 96.682 |
| 0.7847222222222222 | 96.682 |
| 0.7854166666666668 | 96.682 |
| 0.7861111111111111 | 96.682 |
| 0.7868055555555555 | 92.184 |
| 0.7875 | 92.184 |
| 0.7881944444444445 | 92.184 |
| 0.7888888888888889 | 92.184 |
| 0.7895833333333333 | 92.184 |
| 0.7902777777777777 | 92.184 |
| 0.7909722222222223 | 87.692 |
| 0.7916666666666666 | 87.692 |
| 0.7923611111111111 | 87.692 |
| 0.7930555555555556 | 83.205 |
| 0.7937500000000001 | 83.205 |
| 0.7944444444444444 | 83.205 |
| 0.7951388888888888 | 83.205 |
| 0.7958333333333334 | 78.722 |
| 0.7965277777777778 | 78.722 |
| 0.7972222222222222 | 78.722 |
| 0.7979166666666666 | 74.246 |
| 0.7986111111111112 | 74.246 |
| 0.7993055555555556 | 74.246 |
| 0.7999999999999999 | 74.246 |
| 0.8006944444444444 | 74.246 |
| 0.8013888888888889 | 69.775 |
| 0.8020833333333334 | 69.775 |
| 0.8027777777777777 | 69.775 |
| 0.8034722222222223 | 69.775 |
| 0.8041666666666667 | 65.31 |
| 0.8048611111111111 | 65.31 |
| 0.8055555555555555 | 65.31 |
| 0.80625 | 65.31 |
| 0.8069444444444445 | 65.31 |
| 0.8076388888888889 | 60.85 |
| 0.8083333333333332 | 60.85 |
| 0.8090277777777778 | 60.85 |
| 0.8097222222222222 | 60.85 |
| 0.8104166666666667 | 56.398 |
| 0.811111111111111 | 56.398 |
| 0.8118055555555556 | 56.398 |
| 0.8125 | 56.398 |
| 0.8131944444444444 | 56.398 |
| 0.813888888888889 | 51.951 |
| 0.8145833333333333 | 51.951 |
| 0.8152777777777778 | 51.951 |
| 0.8159722222222222 | 51.951 |
| 0.8166666666666668 | 47.511 |
| 0.8173611111111111 | 47.511 |
| 0.8180555555555555 | 47.511 |
| 0.81875 | 47.511 |
| 0.8194444444444445 | 43.079 |
| 0.8201388888888889 | 43.079 |
| 0.8208333333333333 | 43.079 |
| 0.8215277777777777 | 43.079 |
| 0.8222222222222223 | 38.653 |
| 0.8229166666666666 | 38.653 |
| 0.8236111111111111 | 38.653 |
| 0.8243055555555556 | 38.653 |
| 0.8250000000000001 | 38.653 |
| 0.8256944444444444 | 34.234 |
| 0.8263888888888888 | 34.234 |
| 0.8270833333333334 | 34.234 |
| 0.8277777777777778 | 34.234 |
| 0.8284722222222222 | 29.823 |
| 0.8291666666666666 | 29.823 |
| 0.8298611111111112 | 29.823 |
| 0.8305555555555556 | 29.823 |
| 0.8312499999999999 | 25.419 |
| 0.8319444444444444 | 25.419 |
| 0.8326388888888889 | 25.419 |
| 0.8333333333333334 | 25.419 |
| 0.8340277777777777 | 21.024 |
| 0.8347222222222223 | 21.024 |
| 0.8354166666666667 | 21.024 |
| 0.8361111111111111 | 21.024 |
| 0.8368055555555555 | 21.024 |
| 0.8375 | 16.636 |
| 0.8381944444444445 | 16.636 |
| 0.8388888888888889 | 16.636 |
| 0.8395833333333332 | 16.636 |
| 0.8402777777777778 | 12.257 |
| 0.8409722222222222 | 12.257 |
| 0.8416666666666667 | 12.257 |
| 0.842361111111111 | 12.257 |
| 0.8430555555555556 | 12.257 |
| 0.84375 | 7.887 |
| 0.8444444444444444 | 7.887 |
| 0.845138888888889 | 7.887 |
| 0.8458333333333333 | 7.887 |
| 0.8465277777777778 | 7.887 |
| 0.8472222222222222 | 3.525 |
| 0.8479166666666668 | 3.525 |
| 0.8486111111111111 | 3.525 |
| 0.8493055555555555 | 3.525 |
| 0.85 | 3.525 |
| 0.8506944444444445 | 3.525 |
| 0.8513888888888889 | 3.525 |
| 0.8520833333333333 | 3.525 |
| 0.8527777777777777 | 0 |
| 0.8534722222222223 | 0 |
| 0.8541666666666666 | 0 |
| 0.8548611111111111 | 0 |
| 0.8555555555555556 | 0 |
| 0.8562500000000001 | 0 |
| 0.8569444444444444 | 0 |
| 0.8576388888888888 | 0 |
| 0.8583333333333334 | 0 |
| 0.8590277777777778 | 0 |
| 0.8597222222222222 | 0 |
| 0.8604166666666666 | 0 |
| 0.8611111111111112 | 0 |
| 0.8618055555555556 | 0 |
| 0.8624999999999999 | 0 |
| 0.8631944444444444 | 0 |
| 0.8638888888888889 | 0 |
| 0.8645833333333334 | 0 |
| 0.8652777777777777 | 0 |
| 0.8659722222222223 | 0 |
| 0.8666666666666667 | 0 |
| 0.8673611111111111 | 0 |
| 0.8680555555555555 | 0 |
| 0.86875 | 0 |
| 0.8694444444444445 | 0 |
| 0.8701388888888889 | 0 |
| 0.8708333333333332 | 0 |
| 0.8715277777777778 | 0 |
| 0.8722222222222222 | 0 |
| 0.8729166666666667 | 0 |
| 0.873611111111111 | 0 |
| 0.8743055555555556 | 0 |
| 0.875 | 0 |
| 0.8756944444444444 | 0 |
| 0.876388888888889 | 0 |
| 0.8770833333333333 | 0 |
| 0.8777777777777778 | 0 |
| 0.8784722222222222 | 0 |
| 0.8791666666666668 | 0 |
| 0.8798611111111111 | 0 |
| 0.8805555555555555 | 0 |
| 0.88125 | 0 |
| 0.8819444444444445 | 0 |
| 0.8826388888888889 | 0 |
| 0.8833333333333333 | 0 |
| 0.8840277777777777 | 0 |
| 0.8847222222222223 | 0 |
| 0.8854166666666666 | 0 |
| 0.8861111111111111 | 0 |
| 0.8868055555555556 | 0 |
| 0.8875000000000001 | 0 |
| 0.8881944444444444 | 0 |
| 0.8888888888888888 | 0 |
| 0.8895833333333334 | 0 |
| 0.8902777777777778 | 0 |
| 0.8909722222222222 | 0 |
| 0.8916666666666666 | 0 |
| 0.8923611111111112 | 0 |
| 0.8930555555555556 | 0 |
| 0.8937499999999999 | 0 |
| 0.8944444444444444 | 0 |
| 0.8951388888888889 | 0 |
| 0.8958333333333334 | 0 |
| 0.8965277777777777 | 0 |
| 0.8972222222222223 | 0 |
| 0.8979166666666667 | 0 |
| 0.8986111111111111 | 0 |
| 0.8993055555555555 | 0 |
| 0.9 | 0 |
| 0.9006944444444445 | 0 |
| 0.9013888888888889 | 0 |
| 0.9020833333333332 | 0 |
| 0.9027777777777778 | 0 |
| 0.9034722222222222 | 0 |
| 0.9041666666666667 | 0 |
| 0.904861111111111 | 0 |
| 0.9055555555555556 | 0 |
| 0.90625 | 0 |
| 0.9069444444444444 | 0 |
| 0.907638888888889 | 0 |
| 0.9083333333333333 | 0 |
| 0.9090277777777778 | 0 |
| 0.9097222222222222 | 0 |
| 0.9104166666666668 | 0 |
| 0.9111111111111111 | 0 |
| 0.9118055555555555 | 0 |
| 0.9125 | 0 |
| 0.9131944444444445 | 0 |
| 0.9138888888888889 | 0 |
| 0.9145833333333333 | 0 |
| 0.9152777777777777 | 0 |
| 0.9159722222222223 | 0 |
| 0.9166666666666666 | 0 |
| 0.9173611111111111 | 0 |
| 0.9180555555555556 | 0 |
| 0.9187500000000001 | 0 |
| 0.9194444444444444 | 0 |
| 0.9201388888888888 | 0 |
| 0.9208333333333334 | 0 |
| 0.9215277777777778 | 0 |
| 0.9222222222222222 | 0 |
| 0.9229166666666666 | 0 |
| 0.9236111111111112 | 0 |
| 0.9243055555555556 | 0 |
| 0.9249999999999999 | 0 |
| 0.9256944444444444 | 0 |
| 0.9263888888888889 | 0 |
| 0.9270833333333334 | 0 |
| 0.9277777777777777 | 0 |
| 0.9284722222222223 | 0 |
| 0.9291666666666667 | 0 |
| 0.9298611111111111 | 0 |
| 0.9305555555555555 | 0 |
| 0.93125 | 0 |
| 0.9319444444444445 | 0 |
| 0.9326388888888889 | 0 |
| 0.9333333333333332 | 0 |
| 0.9340277777777778 | 0 |
| 0.9347222222222222 | 0 |
| 0.9354166666666667 | 0 |
| 0.936111111111111 | 0 |
| 0.9368055555555556 | 0 |
| 0.9375 | 0 |
| 0.9381944444444444 | 0 |
| 0.938888888888889 | 0 |
| 0.9395833333333333 | 0 |
| 0.9402777777777778 | 0 |
| 0.9409722222222222 | 0 |
| 0.9416666666666668 | 0 |
| 0.9423611111111111 | 0 |
| 0.9430555555555555 | 0 |
| 0.94375 | 0 |
| 0.9444444444444445 | 0 |
| 0.9451388888888889 | 0 |
| 0.9458333333333333 | 0 |
| 0.9465277777777777 | 0 |
| 0.9472222222222223 | 0 |
| 0.9479166666666666 | 0 |
| 0.9486111111111111 | 0 |
| 0.9493055555555556 | 0 |
| 0.9500000000000001 | 0 |
| 0.9506944444444444 | 0 |
| 0.9513888888888888 | 0 |
| 0.9520833333333334 | 0 |
| 0.9527777777777778 | 0 |
| 0.9534722222222222 | 0 |
| 0.9541666666666666 | 0 |
| 0.9548611111111112 | 0 |
| 0.9555555555555556 | 0 |
| 0.9562499999999999 | 0 |
| 0.9569444444444444 | 0 |
| 0.9576388888888889 | 0 |
| 0.9583333333333334 | 0 |
| 0.9590277777777777 | 0 |
| 0.9597222222222223 | 0 |
| 0.9604166666666667 | 0 |
| 0.9611111111111111 | 0 |
| 0.9618055555555555 | 0 |
| 0.9625 | 0 |
| 0.9631944444444445 | 0 |
| 0.9638888888888889 | 0 |
| 0.9645833333333332 | 0 |
| 0.9652777777777778 | 0 |
| 0.9659722222222222 | 0 |
| 0.9666666666666667 | 0 |
| 0.967361111111111 | 0 |
| 0.9680555555555556 | 0 |
| 0.96875 | 0 |
| 0.9694444444444444 | 0 |
| 0.970138888888889 | 0 |
| 0.9708333333333333 | 0 |
| 0.9715277777777778 | 0 |
| 0.9722222222222222 | 0 |
| 0.9729166666666668 | 0 |
| 0.9736111111111111 | 0 |
| 0.9743055555555555 | 0 |
| 0.975 | 0 |
| 0.9756944444444445 | 0 |
| 0.9763888888888889 | 0 |
| 0.9770833333333333 | 0 |
| 0.9777777777777777 | 0 |
| 0.9784722222222223 | 0 |
| 0.9791666666666666 | 0 |
| 0.9798611111111111 | 0 |
| 0.9805555555555556 | 0 |
| 0.9812500000000001 | 0 |
| 0.9819444444444444 | 0 |
| 0.9826388888888888 | 0 |
| 0.9833333333333334 | 0 |
| 0.9840277777777778 | 0 |
| 0.9847222222222222 | 0 |
| 0.9854166666666666 | 0 |
| 0.9861111111111112 | 0 |
| 0.9868055555555556 | 0 |
| 0.9874999999999999 | 0 |
| 0.9881944444444444 | 0 |
| 0.9888888888888889 | 0 |
| 0.9895833333333334 | 0 |
| 0.9902777777777777 | 0 |
| 0.9909722222222223 | 0 |
| 0.9916666666666667 | 0 |
| 0.9923611111111111 | 0 |
| 0.9930555555555555 | 0 |
| 0.99375 | 0 |
| 0.9944444444444445 | 0 |
| 0.9951388888888889 | 0 |
| 0.9958333333333332 | 0 |
| 0.9965277777777778 | 0 |
| 0.9972222222222222 | 0 |
| 0.9979166666666667 | 0 |
| 0.998611111111111 | 0 |
| 0.9993055555555556 | 0 |